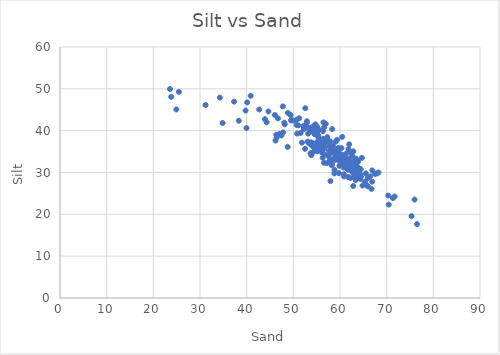
| Category | Series 0 |
|---|---|
| 59.217915737824356 | 34.004 |
| 62.79661086239625 | 29.86 |
| 62.60411205803756 | 30.764 |
| 63.96255402994081 | 29.148 |
| 61.465323986502455 | 30.981 |
| 64.82057558026459 | 26.869 |
| 66.9174492084268 | 30.509 |
| 56.27553455815904 | 33.537 |
| 59.63865832222597 | 33.444 |
| 37.30676374523785 | 46.941 |
| 55.3171345321932 | 36.856 |
| 65.51959920433367 | 29.793 |
| 75.97419523777207 | 23.536 |
| 62.63397121826816 | 33.962 |
| 54.255137447908005 | 36.1 |
| 63.0612253091587 | 30.527 |
| 65.39653571286917 | 27.276 |
| 64.4834251657713 | 29.019 |
| 66.88404263409433 | 27.799 |
| 62.20345659876291 | 30.579 |
| 63.35580447378949 | 28.205 |
| 46.41320978756604 | 38.308 |
| 70.44860161000634 | 22.324 |
| 62.830804892375895 | 26.772 |
| 55.52060689781707 | 35.746 |
| 55.33382839620918 | 40.104 |
| 61.97097278197134 | 32.453 |
| 58.24892989301533 | 34.748 |
| 55.70815587082542 | 36.84 |
| 60.31399974034164 | 33.187 |
| 62.37568476575746 | 30.558 |
| 55.81572774616919 | 36.409 |
| 61.46995383941842 | 31.185 |
| 65.99781457294556 | 26.689 |
| 61.75510039997499 | 30.697 |
| 61.851837566736705 | 33.309 |
| 59.771024519120864 | 29.849 |
| 75.32924198066479 | 19.578 |
| 58.23974753069161 | 31.718 |
| 52.25411995361914 | 40.638 |
| 51.25904292285157 | 42.959 |
| 64.34479666486696 | 29.569 |
| 56.92932366416845 | 37.468 |
| 59.60129848119286 | 32.961 |
| 62.04000213642096 | 31.903 |
| 60.203927188992054 | 33.241 |
| 58.89247480998879 | 33.583 |
| 62.08487306535658 | 30.944 |
| 63.84892552903648 | 29.698 |
| 60.79025768037222 | 31.182 |
| 57.16527152282255 | 32.227 |
| 58.791308166559205 | 29.786 |
| 76.50247743694636 | 17.666 |
| 58.826784900958614 | 30.633 |
| 54.634171166336486 | 40.6 |
| 61.97129243807171 | 36.737 |
| 67.82056620763888 | 29.742 |
| 58.52578052258971 | 34.86 |
| 54.48816867400476 | 36.83 |
| 58.894217394390395 | 33.022 |
| 54.75749124581994 | 40.358 |
| 59.03546449914116 | 37.361 |
| 63.64719377032131 | 30.099 |
| 63.97278760977857 | 29.047 |
| 60.82612080038531 | 31.587 |
| 56.703523106991334 | 34.3 |
| 59.23527849457227 | 33.731 |
| 64.38007500530786 | 28.454 |
| 46.70606426148378 | 42.943 |
| 56.443348847144044 | 41.974 |
| 58.30144337220048 | 35.115 |
| 61.813824551865814 | 35.581 |
| 55.44856806489596 | 40.3 |
| 57.57359544664937 | 36.508 |
| 61.300004008068086 | 33.183 |
| 55.18936634143292 | 37.436 |
| 59.73887576458316 | 35.543 |
| 64.44753851794152 | 30.744 |
| 63.3112462340012 | 28.852 |
| 65.92348095895572 | 28.675 |
| 54.7851019540848 | 35.372 |
| 59.15677625486327 | 34.864 |
| 55.85005927682035 | 35.404 |
| 52.559854931196384 | 45.364 |
| 54.51034322740597 | 41.224 |
| 59.69719875978142 | 34.545 |
| 50.71116398289522 | 41.359 |
| 55.33900920442309 | 38.459 |
| 58.237003796376555 | 35.446 |
| 55.07468891324808 | 40.963 |
| 53.176912398726465 | 39.286 |
| 57.06974054934853 | 36.399 |
| 64.29809810974145 | 30.85 |
| 63.117595350396954 | 31.455 |
| 61.559153484339475 | 31.939 |
| 54.07589553951222 | 37.036 |
| 66.75081519842684 | 26.085 |
| 40.87290301650739 | 48.344 |
| 47.745261717220394 | 45.811 |
| 59.374875552891616 | 37.806 |
| 53.59430211384468 | 39.747 |
| 52.878536627107664 | 41.833 |
| 56.93381402932665 | 41.623 |
| 54.83273742194218 | 39.418 |
| 52.34965050371007 | 40.992 |
| 55.10518261750419 | 39.837 |
| 58.20441911785345 | 35.887 |
| 62.41882341154573 | 32.565 |
| 63.04554216018669 | 31.344 |
| 62.39794269619467 | 34.738 |
| 58.01251592355006 | 35.06 |
| 52.261478442640595 | 40.368 |
| 46.05200159759874 | 43.745 |
| 56.34210579842816 | 39.895 |
| 63.89276366337549 | 32.61 |
| 54.740963399752275 | 41.511 |
| 53.10902179591087 | 40.712 |
| 57.25939329980323 | 38.169 |
| 56.615902299570386 | 40.802 |
| 50.698473963222604 | 42.634 |
| 61.36419022432854 | 34.551 |
| 60.17465832222597 | 33.444 |
| 59.23196559853008 | 33.212 |
| 56.71268506890473 | 36.441 |
| 55.253924061585714 | 36.261 |
| 56.30949437322629 | 37.339 |
| 48.15197193520516 | 41.504 |
| 49.623627601374665 | 42.518 |
| 56.39057681204039 | 38.031 |
| 55.65947303459407 | 37.355 |
| 51.04824933742415 | 41.295 |
| 52.202458456020004 | 41.137 |
| 54.65210444641653 | 39.142 |
| 55.889867017438725 | 37.812 |
| 48.83833583227317 | 44.247 |
| 55.81546876686762 | 37.358 |
| 60.851055220785454 | 33.145 |
| 58.93138789175669 | 35.157 |
| 59.04445773908301 | 33.595 |
| 54.60145461167665 | 36.615 |
| 53.81965654683125 | 37.217 |
| 44.66387491781699 | 44.594 |
| 49.40201440077807 | 43.735 |
| 60.47762126469958 | 34.226 |
| 54.45960220670754 | 40.275 |
| 53.822966315467085 | 40.754 |
| 57.27499640124375 | 38.469 |
| 56.523414850127 | 35.89 |
| 49.94174709771515 | 42.428 |
| 52.901969019490345 | 42.261 |
| 64.68859430632928 | 33.492 |
| 63.214121425866594 | 30.983 |
| 58.5368771165948 | 36.296 |
| 53.726407666685745 | 36.65 |
| 57.986934160741775 | 34.745 |
| 58.01949031719139 | 35.079 |
| 42.67925609748232 | 45.061 |
| 61.50778073428127 | 32.598 |
| 63.34405105890477 | 32.017 |
| 57.778663730272505 | 36.457 |
| 56.25404917766428 | 36.921 |
| 57.93143889278249 | 37.381 |
| 60.675389455459865 | 33.647 |
| 59.26857858743513 | 34.258 |
| 51.56069901240416 | 39.447 |
| 67.4849468676687 | 29.682 |
| 60.38394561190948 | 33.982 |
| 60.214685280596285 | 34.178 |
| 48.785107573822884 | 36.122 |
| 47.43348427407023 | 38.855 |
| 57.83623873302261 | 33.006 |
| 39.76460178332444 | 44.8 |
| 63.7734536830481 | 31.336 |
| 59.73893551275341 | 35.498 |
| 53.04243889278249 | 37.381 |
| 56.571122152396946 | 32.34 |
| 61.750785632285655 | 28.898 |
| 58.177230197569735 | 33.013 |
| 59.52763271586729 | 33.463 |
| 60.81686328373783 | 29.066 |
| 68.25052863047699 | 29.997 |
| 63.06014068595682 | 28.857 |
| 53.83774502876652 | 34.133 |
| 47.80551123244053 | 39.589 |
| 43.924324592797 | 42.747 |
| 40.11199847019238 | 46.764 |
| 54.54804896597273 | 39.183 |
| 63.18040944208046 | 32.878 |
| 58.262152339222695 | 32.016 |
| 58.32145710400836 | 40.384 |
| 53.67014754706407 | 34.584 |
| 46.18411881329905 | 37.622 |
| 49.50671722363003 | 42.451 |
| 51.832763239992396 | 37.136 |
| 59.09003814987965 | 33.158 |
| 66.47895176087643 | 29.074 |
| 71.35023645717912 | 23.882 |
| 60.24008217915575 | 33.879 |
| 39.95712848907202 | 40.632 |
| 57.95056808408269 | 27.931 |
| 34.24548342730404 | 47.907 |
| 60.16769600523361 | 32.058 |
| 60.69208832332601 | 32.064 |
| 55.1934903171914 | 35.079 |
| 60.472923849894165 | 38.524 |
| 55.32643306135288 | 38.894 |
| 52.51973492961044 | 35.649 |
| 46.35623674593636 | 39.042 |
| 44.28231043760603 | 42.003 |
| 34.836545162560554 | 41.826 |
| 71.70823926704817 | 24.257 |
| 59.87331055784183 | 31.595 |
| 47.032950808264474 | 39.257 |
| 23.823244434623064 | 48.087 |
| 31.18783067684936 | 46.136 |
| 38.30581964906474 | 42.373 |
| 62.202780532183084 | 28.676 |
| 63.438833299010255 | 33.312 |
| 60.31249593692947 | 35.829 |
| 57.538099250061535 | 33.866 |
| 56.633555685099715 | 35.784 |
| 59.609491669203024 | 35.833 |
| 53.40100650039982 | 36.953 |
| 65.64830785861525 | 26.996 |
| 53.94203658617648 | 34.667 |
| 60.84309623809431 | 29.569 |
| 54.328639687617006 | 34.967 |
| 24.92923902657654 | 45.074 |
| 23.567773421010827 | 49.951 |
| 25.475673911290954 | 49.271 |
| 48.067425666220075 | 41.916 |
| 62.863532994455845 | 35.047 |
| 59.699397990912765 | 33.64 |
| 61.098049601047364 | 32.395 |
| 59.689537262182306 | 35.044 |
| 70.33513455137992 | 24.487 |
| 57.63247751401205 | 35.089 |
| 65.36657464204268 | 27.775 |
| 56.19601097981781 | 34.687 |
| 50.817891060094226 | 39.302 |